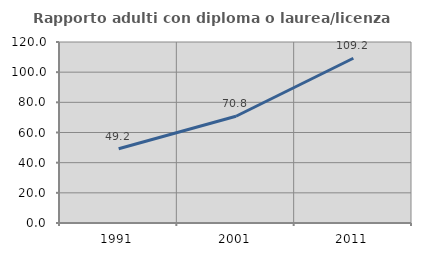
| Category | Rapporto adulti con diploma o laurea/licenza media  |
|---|---|
| 1991.0 | 49.231 |
| 2001.0 | 70.787 |
| 2011.0 | 109.211 |